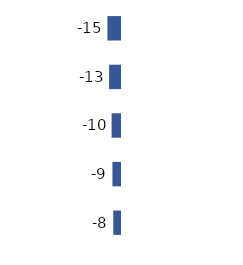
| Category | Series 0 |
|---|---|
| 0 | -15 |
| 1 | -13 |
| 2 | -10 |
| 3 | -9 |
| 4 | -8 |